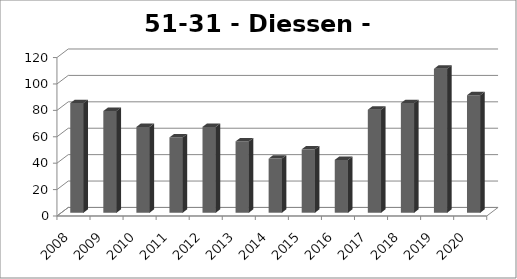
| Category | Diessen - Baarschot |
|---|---|
| 2008.0 | 83 |
| 2009.0 | 77 |
| 2010.0 | 65 |
| 2011.0 | 57 |
| 2012.0 | 65 |
| 2013.0 | 54 |
| 2014.0 | 41 |
| 2015.0 | 48 |
| 2016.0 | 40 |
| 2017.0 | 78 |
| 2018.0 | 83 |
| 2019.0 | 109 |
| 2020.0 | 89 |